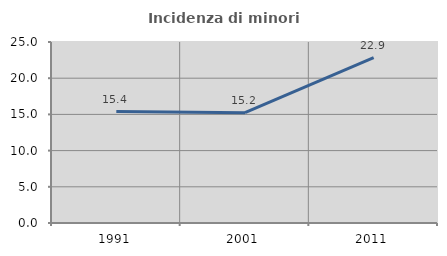
| Category | Incidenza di minori stranieri |
|---|---|
| 1991.0 | 15.385 |
| 2001.0 | 15.238 |
| 2011.0 | 22.857 |